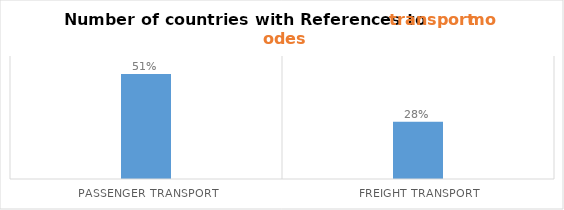
| Category | Series 0 |
|---|---|
| Passenger Transport | 0.512 |
| Freight Transport | 0.279 |